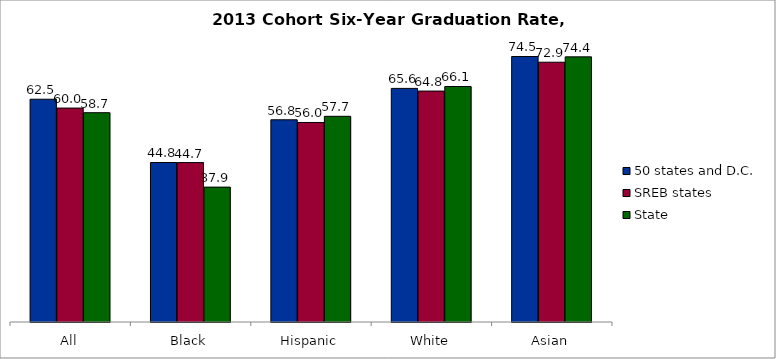
| Category | 50 states and D.C. | SREB states | State |
|---|---|---|---|
| All | 62.534 | 60.049 | 58.749 |
| Black | 44.775 | 44.749 | 37.862 |
| Hispanic | 56.761 | 56.005 | 57.739 |
| White | 65.571 | 64.824 | 66.108 |
| Asian | 74.527 | 72.924 | 74.424 |